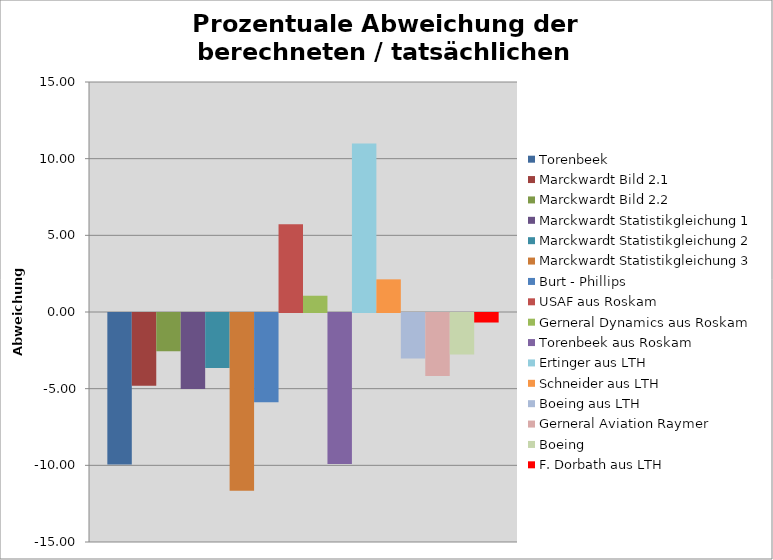
| Category | Torenbeek | Marckwardt Bild 2.1 | Marckwardt Bild 2.2 | Marckwardt Statistikgleichung 1 | Marckwardt Statistikgleichung 2 | Marckwardt Statistikgleichung 3 | Burt - Phillips | USAF aus Roskam | Gerneral Dynamics aus Roskam | Torenbeek aus Roskam | Ertinger aus LTH | Schneider aus LTH | Boeing aus LTH | Gerneral Aviation Raymer | Boeing | F. Dorbath aus LTH |
|---|---|---|---|---|---|---|---|---|---|---|---|---|---|---|---|---|
| 0 | -9.887 | -4.739 | -2.496 | -4.961 | -3.592 | -11.599 | -5.823 | 5.725 | 1.061 | -9.84 | 10.983 | 2.129 | -2.96 | -4.111 | -2.699 | -0.621 |